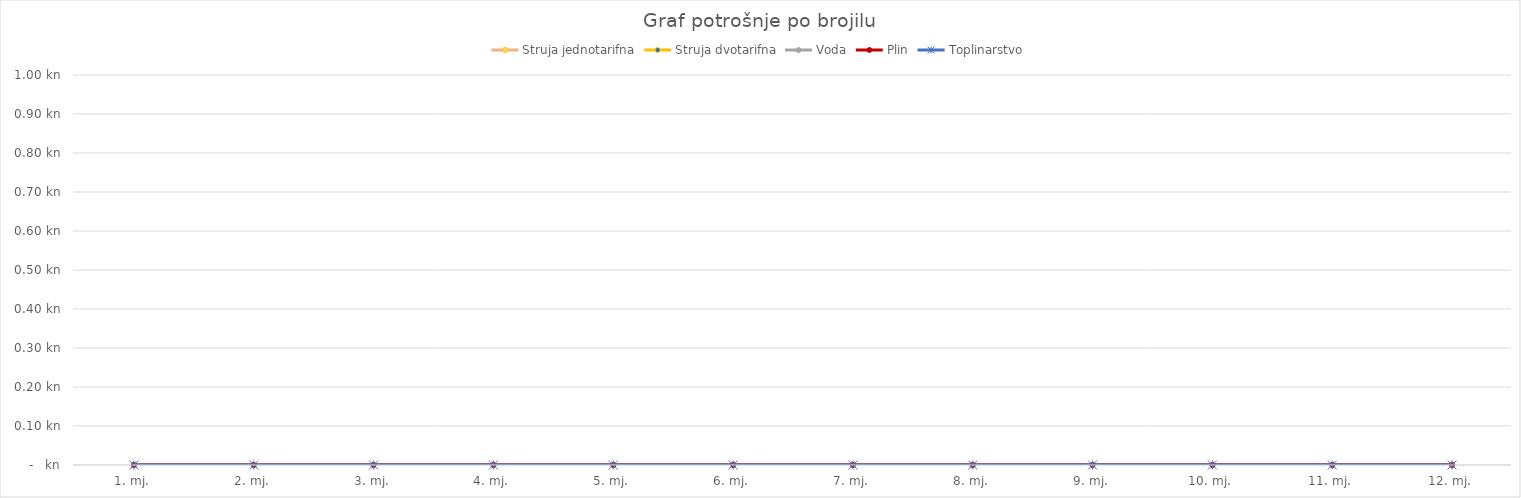
| Category | Struja jednotarifna | Struja dvotarifna | Voda | Plin | Toplinarstvo |
|---|---|---|---|---|---|
| 1. mj. | 0 | 0 | 0 | 0 | 0 |
| 2. mj. | 0 | 0 | 0 | 0 | 0 |
| 3. mj. | 0 | 0 | 0 | 0 | 0 |
| 4. mj. | 0 | 0 | 0 | 0 | 0 |
| 5. mj. | 0 | 0 | 0 | 0 | 0 |
| 6. mj. | 0 | 0 | 0 | 0 | 0 |
| 7. mj. | 0 | 0 | 0 | 0 | 0 |
| 8. mj. | 0 | 0 | 0 | 0 | 0 |
| 9. mj. | 0 | 0 | 0 | 0 | 0 |
| 10. mj. | 0 | 0 | 0 | 0 | 0 |
| 11. mj. | 0 | 0 | 0 | 0 | 0 |
| 12. mj. | 0 | 0 | 0 | 0 | 0 |